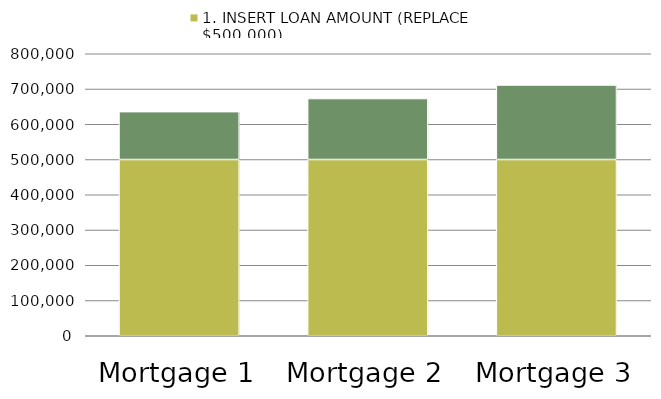
| Category | 1. INSERT LOAN AMOUNT (REPLACE $500,000) | TOTAL INTEREST |
|---|---|---|
| Mortgage 1 | 500000 | 135781.508 |
| Mortgage 2 | 500000 | 172925.101 |
| Mortgage 3 | 500000 | 211316.971 |